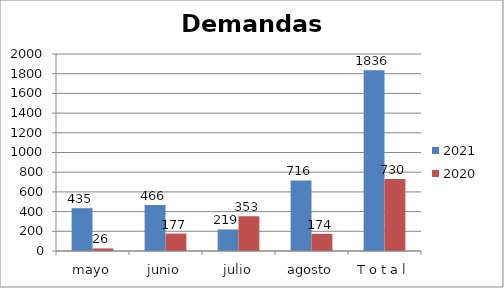
| Category | 2021 | 2020 |
|---|---|---|
| mayo | 435 | 26 |
| junio | 466 | 177 |
| julio | 219 | 353 |
| agosto | 716 | 174 |
| T o t a l | 1836 | 730 |